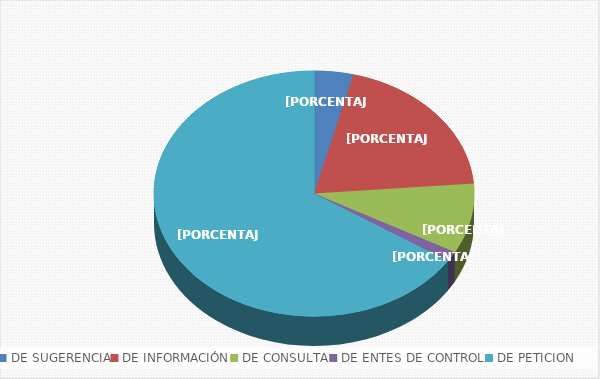
| Category | Series 0 |
|---|---|
| DE SUGERENCIA | 3 |
| DE INFORMACIÓN | 15 |
| DE CONSULTA | 7 |
| DE ENTES DE CONTROL | 1 |
| DE PETICION | 50 |